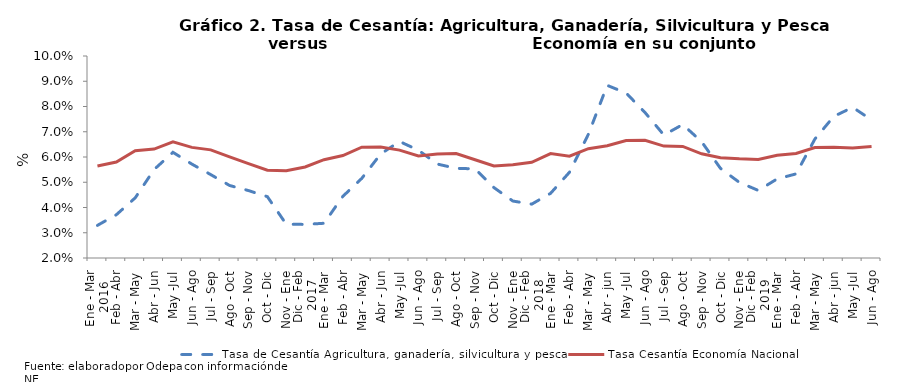
| Category | Tasa de Cesantía Agricultura, ganadería, silvicultura y pesca |
|---|---|
| 0 | 0.033 |
| 1 | 0.037 |
| 2 | 0.044 |
| 3 | 0.055 |
| 4 | 0.062 |
| 5 | 0.057 |
| 6 | 0.053 |
| 7 | 0.049 |
| 8 | 0.047 |
| 9 | 0.044 |
| 10 | 0.033 |
| 11 | 0.033 |
| 12 | 0.034 |
| 13 | 0.044 |
| 14 | 0.052 |
| 15 | 0.061 |
| 16 | 0.066 |
| 17 | 0.063 |
| 18 | 0.057 |
| 19 | 0.055 |
| 20 | 0.055 |
| 21 | 0.048 |
| 22 | 0.043 |
| 23 | 0.041 |
| 24 | 0.046 |
| 25 | 0.054 |
| 26 | 0.069 |
| 27 | 0.088 |
| 28 | 0.085 |
| 29 | 0.078 |
| 30 | 0.069 |
| 31 | 0.073 |
| 32 | 0.066 |
| 33 | 0.055 |
| 34 | 0.05 |
| 35 | 0.047 |
| 36 | 0.051 |
| 37 | 0.053 |
| 38 | 0.067 |
| 39 | 0.076 |
| 40 | 0.08 |
| 41 | 0.075 |